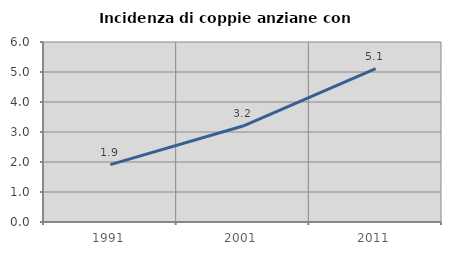
| Category | Incidenza di coppie anziane con figli |
|---|---|
| 1991.0 | 1.914 |
| 2001.0 | 3.199 |
| 2011.0 | 5.11 |